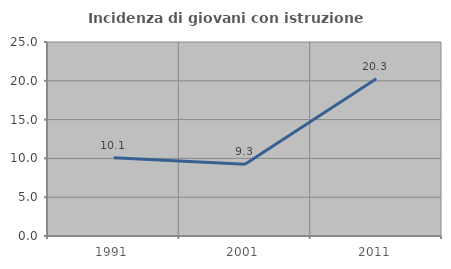
| Category | Incidenza di giovani con istruzione universitaria |
|---|---|
| 1991.0 | 10.078 |
| 2001.0 | 9.259 |
| 2011.0 | 20.253 |